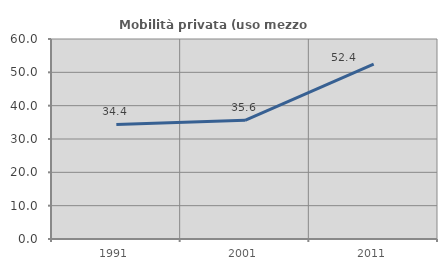
| Category | Mobilità privata (uso mezzo privato) |
|---|---|
| 1991.0 | 34.382 |
| 2001.0 | 35.589 |
| 2011.0 | 52.448 |